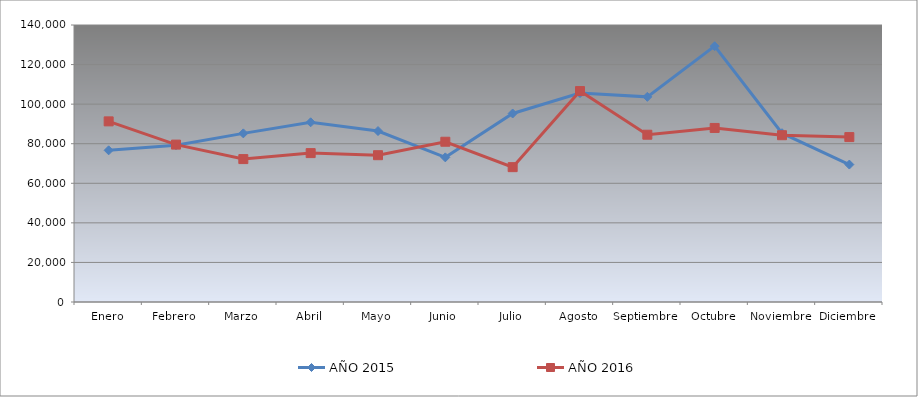
| Category | AÑO 2015 | AÑO 2016 |
|---|---|---|
| Enero | 76656.067 | 91293.7 |
| Febrero | 79277.9 | 79553.046 |
| Marzo | 85228.159 | 72228.94 |
| Abril | 90825.121 | 75256.115 |
| Mayo | 86408.913 | 74193.383 |
| Junio | 73104.507 | 80997.625 |
| Julio | 95278.518 | 68152.835 |
| Agosto | 105607.795 | 106613.596 |
| Septiembre | 103683.258 | 84549.265 |
| Octubre | 129297.263 | 87967.488 |
| Noviembre | 85311.834 | 84300.834 |
| Diciembre | 69469.271 | 83353.117 |